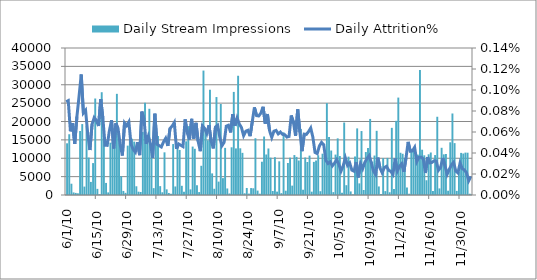
| Category | Daily Stream Impressions |
|---|---|
| 6/1/10 | 14068.125 |
| 6/2/10 | 16532.75 |
| 6/3/10 | 3069.625 |
| 6/4/10 | 698.25 |
| 6/5/10 | 568.5 |
| 6/6/10 | 459.25 |
| 6/7/10 | 17408.75 |
| 6/8/10 | 19298.75 |
| 6/9/10 | 2287.125 |
| 6/10/10 | 18856.625 |
| 6/11/10 | 10187.125 |
| 6/12/10 | 3561 |
| 6/13/10 | 8683.25 |
| 6/14/10 | 26254.625 |
| 6/15/10 | 1669.25 |
| 6/16/10 | 210.5 |
| 6/17/10 | 27967.875 |
| 6/18/10 | 15547.875 |
| 6/19/10 | 3287 |
| 6/20/10 | 712.125 |
| 6/21/10 | 14225.25 |
| 6/22/10 | 14770.5 |
| 6/23/10 | 16654.125 |
| 6/24/10 | 27527.875 |
| 6/25/10 | 17045.5 |
| 6/26/10 | 5102.25 |
| 6/27/10 | 1103 |
| 6/28/10 | 591.875 |
| 6/29/10 | 13433.125 |
| 6/30/10 | 17204.75 |
| 7/1/10 | 15335.25 |
| 7/2/10 | 14529.875 |
| 7/3/10 | 2372.875 |
| 7/4/10 | 900.375 |
| 7/5/10 | 815.5 |
| 7/6/10 | 17174.25 |
| 7/7/10 | 25068.75 |
| 7/8/10 | 16024.5 |
| 7/9/10 | 23459.75 |
| 7/10/10 | 12876.5 |
| 7/11/10 | 1868.125 |
| 7/12/10 | 14331.625 |
| 7/13/10 | 16047.625 |
| 7/14/10 | 2415.625 |
| 7/15/10 | 741.5 |
| 7/16/10 | 11612.125 |
| 7/17/10 | 1537.25 |
| 7/18/10 | 553 |
| 7/19/10 | 341.125 |
| 7/20/10 | 13865.25 |
| 7/21/10 | 2319.875 |
| 7/22/10 | 13518.375 |
| 7/23/10 | 12255.625 |
| 7/24/10 | 2503.75 |
| 7/25/10 | 891.375 |
| 7/26/10 | 14605.875 |
| 7/27/10 | 18740.875 |
| 7/28/10 | 1532.25 |
| 7/29/10 | 13177.5 |
| 7/30/10 | 12574.25 |
| 7/31/10 | 2654.75 |
| 8/1/10 | 792.625 |
| 8/2/10 | 7948.125 |
| 8/3/10 | 33857.75 |
| 8/4/10 | 17857.25 |
| 8/5/10 | 14898.125 |
| 8/6/10 | 28609.5 |
| 8/7/10 | 5879.5 |
| 8/8/10 | 1696.875 |
| 8/9/10 | 26652.375 |
| 8/10/10 | 3643.5 |
| 8/11/10 | 24760.875 |
| 8/12/10 | 4585.625 |
| 8/13/10 | 12824 |
| 8/14/10 | 1779.375 |
| 8/15/10 | 415.125 |
| 8/16/10 | 12980.375 |
| 8/17/10 | 28051.375 |
| 8/18/10 | 12677.125 |
| 8/19/10 | 32449.625 |
| 8/20/10 | 12709.75 |
| 8/21/10 | 11467.5 |
| 8/22/10 | 460.25 |
| 8/23/10 | 1914.125 |
| 8/24/10 | 381.75 |
| 8/25/10 | 1887.625 |
| 8/26/10 | 1825.25 |
| 8/27/10 | 15447.5 |
| 8/28/10 | 1200 |
| 8/29/10 | 358.375 |
| 8/30/10 | 9054.75 |
| 8/31/10 | 15916 |
| 9/1/10 | 11024.875 |
| 9/2/10 | 12658.75 |
| 9/3/10 | 10155.625 |
| 9/4/10 | 1083.75 |
| 9/5/10 | 10286.625 |
| 9/6/10 | 923.875 |
| 9/7/10 | 9161.25 |
| 9/8/10 | 501.125 |
| 9/9/10 | 17055.875 |
| 9/10/10 | 1165.875 |
| 9/11/10 | 8703.375 |
| 9/12/10 | 10161.625 |
| 9/13/10 | 2551.375 |
| 9/14/10 | 10865.625 |
| 9/15/10 | 10364.5 |
| 9/16/10 | 9385.125 |
| 9/17/10 | 17986 |
| 9/18/10 | 1432 |
| 9/19/10 | 10208.5 |
| 9/20/10 | 8973.125 |
| 9/21/10 | 10719.875 |
| 9/22/10 | 907.625 |
| 9/23/10 | 9009.875 |
| 9/24/10 | 9381.5 |
| 9/25/10 | 10808.125 |
| 9/26/10 | 1033.875 |
| 9/27/10 | 11241.5 |
| 9/28/10 | 10800.25 |
| 9/29/10 | 25001 |
| 9/30/10 | 15812 |
| 10/1/10 | 12100.25 |
| 10/2/10 | 776 |
| 10/3/10 | 10994.375 |
| 10/4/10 | 15416.375 |
| 10/5/10 | 10596.625 |
| 10/6/10 | 636.125 |
| 10/7/10 | 19719.5 |
| 10/8/10 | 2668.125 |
| 10/9/10 | 10440 |
| 10/10/10 | 972.125 |
| 10/11/10 | 164.375 |
| 10/12/10 | 10497.375 |
| 10/13/10 | 18124.125 |
| 10/14/10 | 3164.875 |
| 10/15/10 | 17403.75 |
| 10/16/10 | 1354.625 |
| 10/17/10 | 11689.5 |
| 10/18/10 | 12794.125 |
| 10/19/10 | 20697.75 |
| 10/20/10 | 9080.25 |
| 10/21/10 | 10733.5 |
| 10/22/10 | 17464 |
| 10/23/10 | 2325.75 |
| 10/24/10 | 252 |
| 10/25/10 | 10026.25 |
| 10/26/10 | 1058.25 |
| 10/27/10 | 10093.75 |
| 10/28/10 | 747.625 |
| 10/29/10 | 18275.25 |
| 10/30/10 | 1609.875 |
| 10/31/10 | 20183.25 |
| 11/1/10 | 26507.375 |
| 11/2/10 | 11496.375 |
| 11/3/10 | 11219.25 |
| 11/4/10 | 10041.125 |
| 11/5/10 | 2066.875 |
| 11/6/10 | 350.875 |
| 11/7/10 | 12446.5 |
| 11/8/10 | 11980.5 |
| 11/9/10 | 11459.5 |
| 11/10/10 | 10984 |
| 11/11/10 | 33980.125 |
| 11/12/10 | 12322.625 |
| 11/13/10 | 10797.875 |
| 11/14/10 | 4013.625 |
| 11/15/10 | 11074.875 |
| 11/16/10 | 11565.5 |
| 11/17/10 | 1092.875 |
| 11/18/10 | 10863.25 |
| 11/19/10 | 21287.5 |
| 11/20/10 | 1795.125 |
| 11/21/10 | 12846.75 |
| 11/22/10 | 11064.5 |
| 11/23/10 | 11158.125 |
| 11/24/10 | 1166.125 |
| 11/25/10 | 14345.375 |
| 11/26/10 | 22181.625 |
| 11/27/10 | 14116.375 |
| 11/28/10 | 1116.75 |
| 11/29/10 | 6416.625 |
| 11/30/10 | 11457.875 |
| 12/1/10 | 11288.625 |
| 12/2/10 | 11531.5 |
| 12/3/10 | 11509.625 |
| 12/4/10 | 344.875 |
| 12/5/10 | 104.75 |